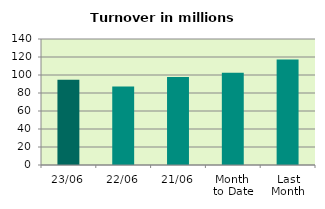
| Category | Series 0 |
|---|---|
| 23/06 | 94.755 |
| 22/06 | 87.167 |
| 21/06 | 97.898 |
| Month 
to Date | 102.611 |
| Last
Month | 117.306 |